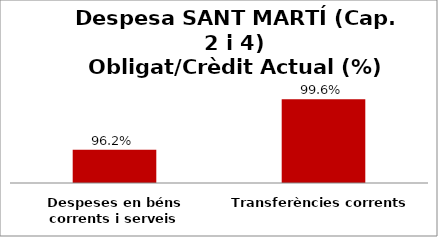
| Category | Series 0 |
|---|---|
| Despeses en béns corrents i serveis | 0.962 |
| Transferències corrents | 0.996 |